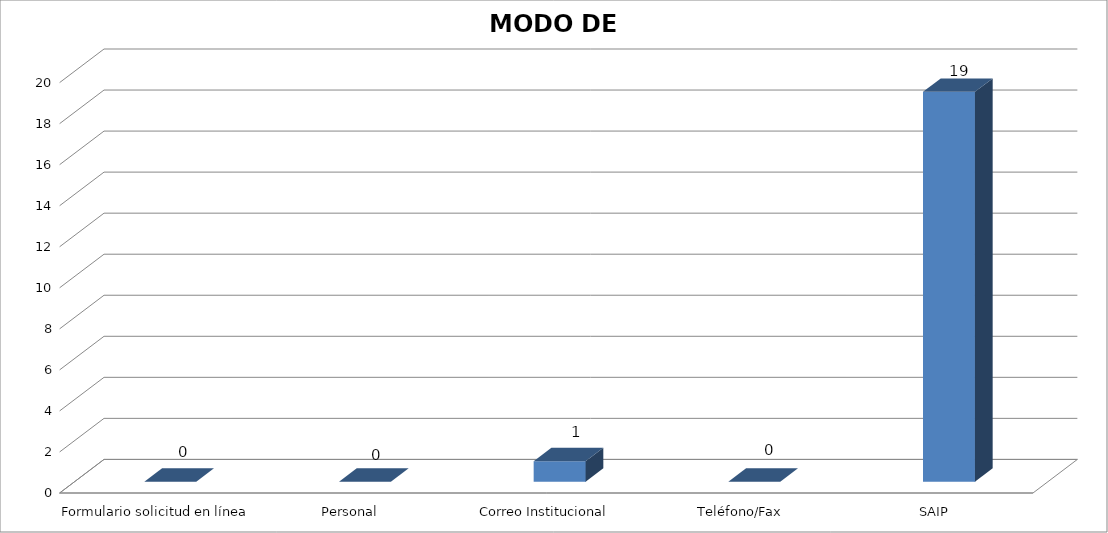
| Category | Series 0 | Series 1 | Series 2 |
|---|---|---|---|
| Formulario solicitud en línea |  | 0 |  |
| Personal |  | 0 |  |
| Correo Institucional |  | 1 |  |
| Teléfono/Fax |  | 0 |  |
| SAIP |  | 19 |  |